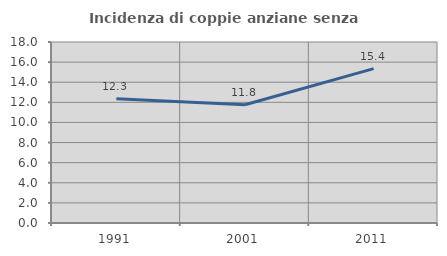
| Category | Incidenza di coppie anziane senza figli  |
|---|---|
| 1991.0 | 12.349 |
| 2001.0 | 11.765 |
| 2011.0 | 15.357 |